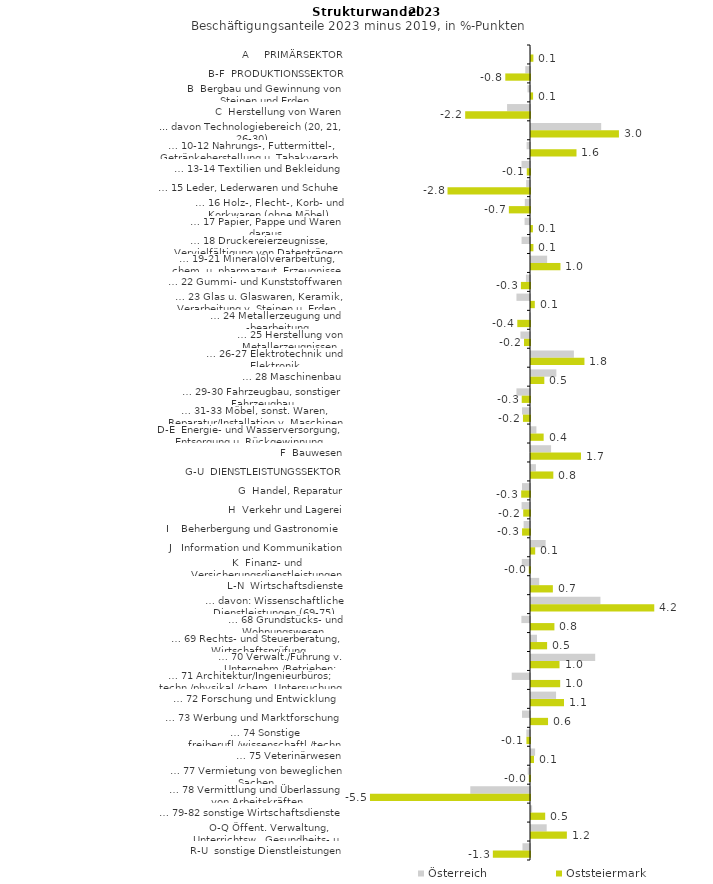
| Category | Österreich | Oststeiermark |
|---|---|---|
| A     PRIMÄRSEKTOR | -0.007 | 0.081 |
| B-F  PRODUKTIONSSEKTOR | -0.161 | -0.842 |
| B  Bergbau und Gewinnung von Steinen und Erden | -0.086 | 0.071 |
| C  Herstellung von Waren | -0.782 | -2.209 |
| ... davon Technologiebereich (20, 21, 26-30) | 2.393 | 2.998 |
| … 10-12 Nahrungs-, Futtermittel-, Getränkeherstellung u. Tabakverarb. | -0.116 | 1.551 |
| … 13-14 Textilien und Bekleidung | -0.289 | -0.11 |
| … 15 Leder, Lederwaren und Schuhe | -0.13 | -2.812 |
| … 16 Holz-, Flecht-, Korb- und Korkwaren (ohne Möbel)  | -0.177 | -0.72 |
| … 17 Papier, Pappe und Waren daraus  | -0.185 | 0.065 |
| … 18 Druckereierzeugnisse, Vervielfältigung von Datenträgern | -0.288 | 0.082 |
| … 19-21 Mineralölverarbeitung, chem. u. pharmazeut. Erzeugnisse | 0.549 | 1.004 |
| … 22 Gummi- und Kunststoffwaren | -0.139 | -0.31 |
| … 23 Glas u. Glaswaren, Keramik, Verarbeitung v. Steinen u. Erden  | -0.462 | 0.13 |
| … 24 Metallerzeugung und -bearbeitung | -0.032 | -0.433 |
| … 25 Herstellung von Metallerzeugnissen  | -0.325 | -0.205 |
| … 26-27 Elektrotechnik und Elektronik | 1.462 | 1.822 |
| … 28 Maschinenbau | 0.864 | 0.454 |
| … 29-30 Fahrzeugbau, sonstiger Fahrzeugbau | -0.462 | -0.282 |
| … 31-33 Möbel, sonst. Waren, Reparatur/Installation v. Maschinen | -0.273 | -0.24 |
| D-E  Energie- und Wasserversorgung, Entsorgung u. Rückgewinnung | 0.184 | 0.431 |
| F  Bauwesen | 0.684 | 1.704 |
| G-U  DIENSTLEISTUNGSSEKTOR | 0.167 | 0.761 |
| G  Handel, Reparatur | -0.273 | -0.301 |
| H  Verkehr und Lagerei | -0.287 | -0.231 |
| I    Beherbergung und Gastronomie | -0.218 | -0.271 |
| J   Information und Kommunikation | 0.499 | 0.143 |
| K  Finanz- und Versicherungsdienstleistungen | -0.279 | -0.04 |
| L-N  Wirtschaftsdienste | 0.279 | 0.746 |
| … davon: Wissenschaftliche Dienstleistungen (69-75) | 2.367 | 4.202 |
| … 68 Grundstücks- und Wohnungswesen  | -0.294 | 0.798 |
| … 69 Rechts- und Steuerberatung, Wirtschaftsprüfung | 0.205 | 0.549 |
| … 70 Verwalt./Führung v. Unternehm./Betrieben; Unternehmensberat. | 2.188 | 0.972 |
| … 71 Architektur/Ingenieurbüros; techn./physikal./chem. Untersuchung | -0.622 | 0.994 |
| … 72 Forschung und Entwicklung  | 0.854 | 1.125 |
| … 73 Werbung und Marktforschung | -0.273 | 0.581 |
| … 74 Sonstige freiberufl./wissenschaftl./techn. Tätigkeiten | -0.124 | -0.122 |
| … 75 Veterinärwesen | 0.14 | 0.102 |
| … 77 Vermietung von beweglichen Sachen  | -0.077 | -0.04 |
| … 78 Vermittlung und Überlassung von Arbeitskräften | -2.035 | -5.455 |
| … 79-82 sonstige Wirtschaftsdienste | 0.039 | 0.484 |
| O-Q Öffent. Verwaltung, Unterrichtsw., Gesundheits- u. Sozialwesen | 0.535 | 1.223 |
| R-U  sonstige Dienstleistungen | -0.256 | -1.266 |